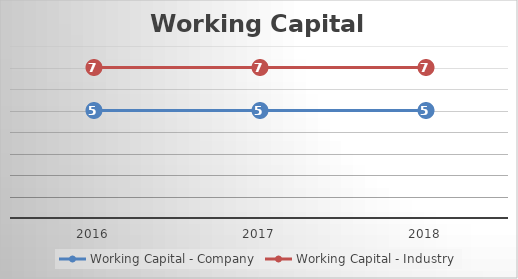
| Category | Working Capital - Company | Working Capital - Industry |
|---|---|---|
| 2016.0 | 5 | 7 |
| 2017.0 | 5 | 7 |
| 2018.0 | 5 | 7 |